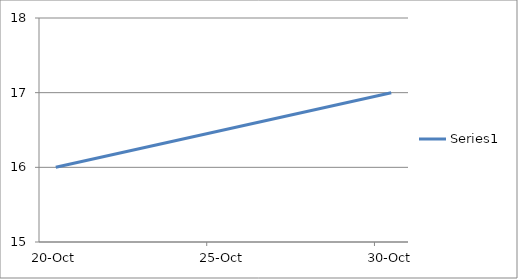
| Category | Series 0 |
|---|---|
| 2011-10-20 | 16 |
| 2011-10-30 | 17 |